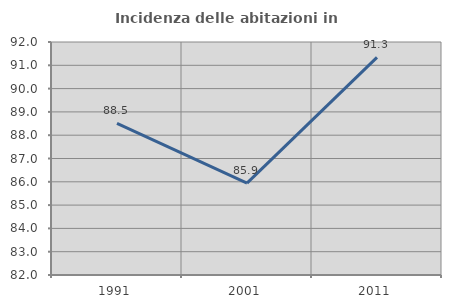
| Category | Incidenza delle abitazioni in proprietà  |
|---|---|
| 1991.0 | 88.511 |
| 2001.0 | 85.944 |
| 2011.0 | 91.339 |